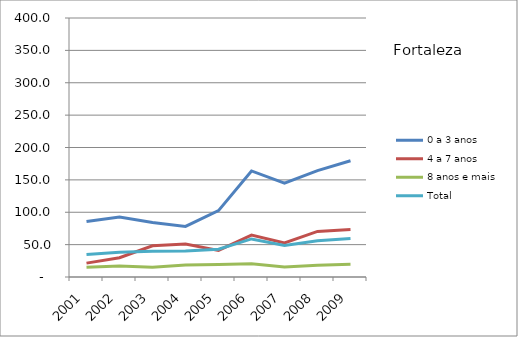
| Category | 0 a 3 anos | 4 a 7 anos | 8 anos e mais | Total |
|---|---|---|---|---|
| 2001.0 | 85.8 | 21.4 | 15.1 | 34.7 |
| 2002.0 | 92.8 | 29.7 | 17 | 38.3 |
| 2003.0 | 84.2 | 48.1 | 14.9 | 39.9 |
| 2004.0 | 78.2 | 50.8 | 18.5 | 40.1 |
| 2005.0 | 102.5 | 41.1 | 19.4 | 42.8 |
| 2006.0 | 163.8 | 64.8 | 20.6 | 58.8 |
| 2007.0 | 144.9 | 52.6 | 15.6 | 48.6 |
| 2008.0 | 164.2 | 70.4 | 18.3 | 56.1 |
| 2009.0 | 179.5 | 73.3 | 19.7 | 59.6 |